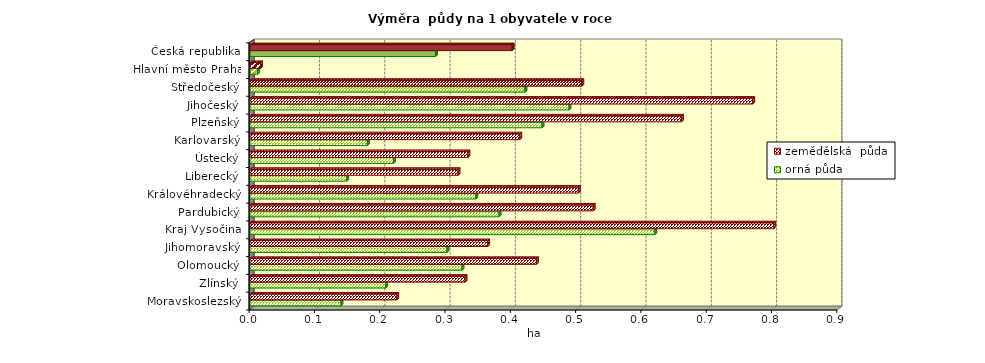
| Category | orná půda | zemědělská  půda |
|---|---|---|
| Moravskoslezský | 0.139 | 0.225 |
| Zlínský | 0.208 | 0.329 |
| Olomoucký | 0.325 | 0.439 |
| Jihomoravský | 0.301 | 0.364 |
| Kraj Vysočina | 0.62 | 0.802 |
| Pardubický | 0.381 | 0.525 |
| Královéhradecký | 0.346 | 0.503 |
| Liberecký | 0.148 | 0.319 |
| Ústecký | 0.22 | 0.334 |
| Karlovarský | 0.18 | 0.413 |
| Plzeňský | 0.447 | 0.661 |
| Jihočeský | 0.489 | 0.77 |
| Středočeský | 0.421 | 0.508 |
| Hlavní město Praha | 0.012 | 0.016 |
| Česká republika | 0.284 | 0.401 |